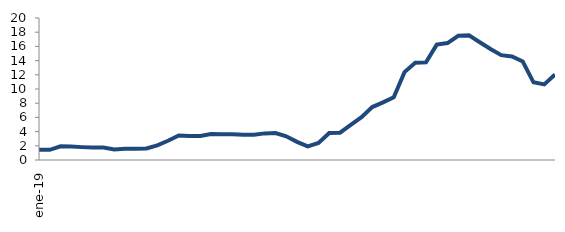
| Category | Series 0 |
|---|---|
| 2019-01-01 | 1.458 |
| 2019-02-01 | 1.432 |
| 2019-03-01 | 1.92 |
| 2019-04-01 | 1.902 |
| 2019-05-01 | 1.814 |
| 2019-06-01 | 1.756 |
| 2019-07-01 | 1.75 |
| 2019-08-01 | 1.495 |
| 2019-09-01 | 1.596 |
| 2019-10-01 | 1.597 |
| 2019-11-01 | 1.624 |
| 2019-12-01 | 2.057 |
| 2020-01-01 | 2.71 |
| 2020-02-01 | 3.453 |
| 2020-03-01 | 3.382 |
| 2020-04-01 | 3.383 |
| 2020-05-01 | 3.648 |
| 2020-06-01 | 3.638 |
| 2020-07-01 | 3.61 |
| 2020-08-01 | 3.571 |
| 2020-09-01 | 3.559 |
| 2020-10-01 | 3.75 |
| 2020-11-01 | 3.789 |
| 2020-12-01 | 3.346 |
| 2021-01-01 | 2.551 |
| 2021-02-01 | 1.916 |
| 2021-03-01 | 2.39 |
| 2021-04-01 | 3.807 |
| 2021-05-01 | 3.85 |
| 2021-06-01 | 4.942 |
| 2021-07-01 | 6.041 |
| 2021-08-01 | 7.459 |
| 2021-09-01 | 8.119 |
| 2021-10-01 | 8.829 |
| 2021-11-01 | 12.381 |
| 2021-12-01 | 13.709 |
| 2022-01-01 | 13.747 |
| 2022-02-01 | 16.254 |
| 2022-03-01 | 16.473 |
| 2022-04-01 | 17.493 |
| 2022-05-01 | 17.552 |
| 2022-06-01 | 16.588 |
| 2022-07-01 | 15.631 |
| 2022-08-01 | 14.77 |
| 2022-09-01 | 14.59 |
| 2022-10-01 | 13.87 |
| 2022-11-01 | 10.941 |
| 2022-12-01 | 10.654 |
| 2023-01-01 | 12.036 |